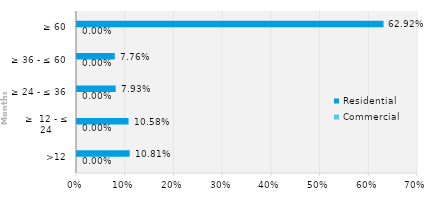
| Category | Commercial | Residential |
|---|---|---|
| >12 | 0 | 0.108 |
| ≥  12 - ≤ 24 | 0 | 0.106 |
| ≥ 24 - ≤ 36 | 0 | 0.079 |
| ≥ 36 - ≤ 60 | 0 | 0.078 |
| ≥ 60 | 0 | 0.629 |